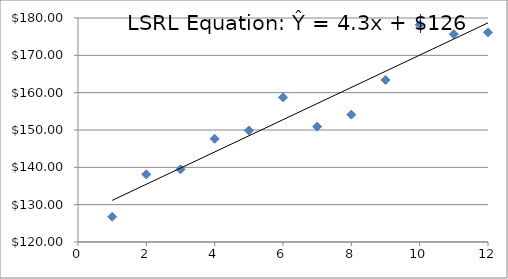
| Category | Series 0 |
|---|---|
| 1.0 | 126.75 |
| 2.0 | 138.12 |
| 3.0 | 139.45 |
| 4.0 | 147.65 |
| 5.0 | 149.87 |
| 6.0 | 158.76 |
| 7.0 | 150.91 |
| 8.0 | 154.12 |
| 9.0 | 163.4 |
| 10.0 | 178.21 |
| 11.0 | 175.67 |
| 12.0 | 176.16 |